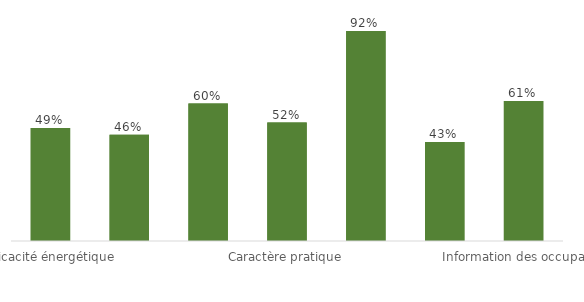
| Category | Series 0 | Series 4 | Series 5 | Series 1 | Series 2 | Series 3 |
|---|---|---|---|---|---|---|
| Efficacité énergétique |  |  | 0.493 |  |  | 0.493 |
| Flexibilité énergétique et stockage de l’énergie |  |  | 0.464 |  |  | 0.464 |
| Confort |  |  | 0.6 |  |  | 0.6 |
| Caractère pratique |  |  | 0.517 |  |  | 0.517 |
| Santé, bien-être et accessibilité |  |  | 0.917 |  |  | 0.917 |
| Entretien et prédiction des pannes |  |  | 0.433 |  |  | 0.433 |
| Information des occupants |  |  | 0.611 |  |  | 0.611 |